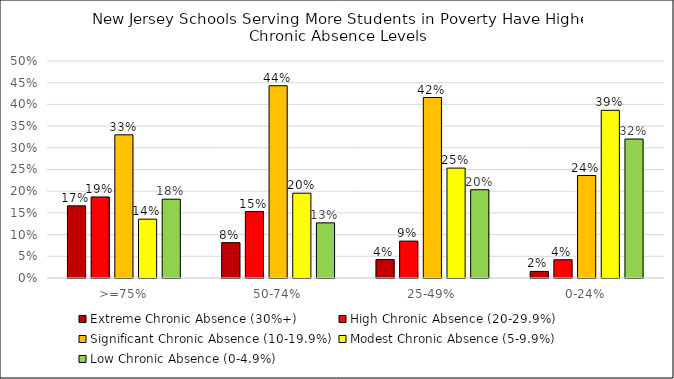
| Category | Extreme Chronic Absence (30%+) | High Chronic Absence (20-29.9%) | Significant Chronic Absence (10-19.9%) | Modest Chronic Absence (5-9.9%) | Low Chronic Absence (0-4.9%) |
|---|---|---|---|---|---|
| >=75% | 0.166 | 0.187 | 0.33 | 0.136 | 0.182 |
| 50-74% | 0.081 | 0.153 | 0.443 | 0.195 | 0.127 |
| 25-49% | 0.043 | 0.085 | 0.416 | 0.253 | 0.203 |
| 0-24% | 0.015 | 0.042 | 0.236 | 0.386 | 0.32 |